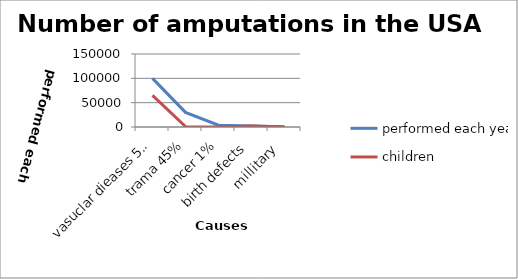
| Category | performed each year  | children  |
|---|---|---|
| vasuclar dieases 54% | 100000 | 65000 |
| trama 45% | 30000 | 968 |
| cancer 1% | 3700 | 235 |
| birth defects  | 2250 | 2250 |
| millitary  | 469 | 0 |